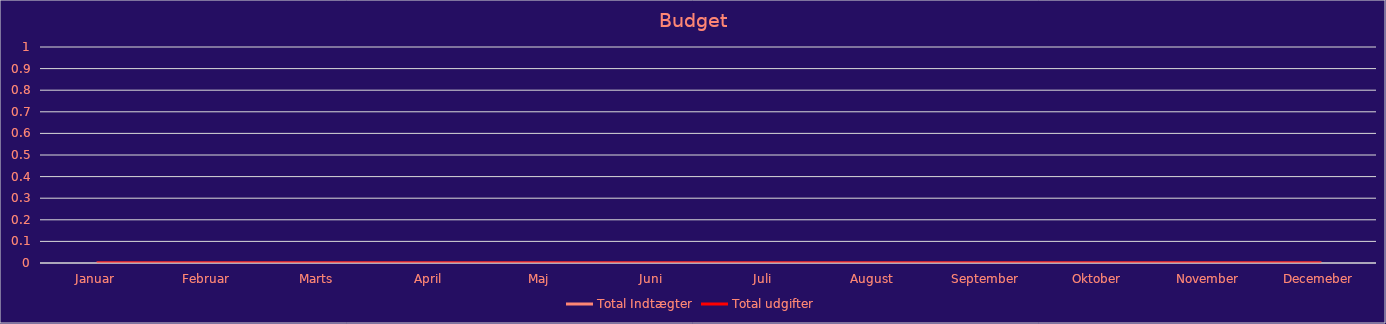
| Category | Total Indtægter | Total udgifter |
|---|---|---|
| Januar | 0 | 0 |
| Februar | 0 | 0 |
| Marts | 0 | 0 |
| April | 0 | 0 |
| Maj | 0 | 0 |
| Juni | 0 | 0 |
| Juli | 0 | 0 |
| August  | 0 | 0 |
| September | 0 | 0 |
| Oktober | 0 | 0 |
| November | 0 | 0 |
| Decemeber | 0 | 0 |